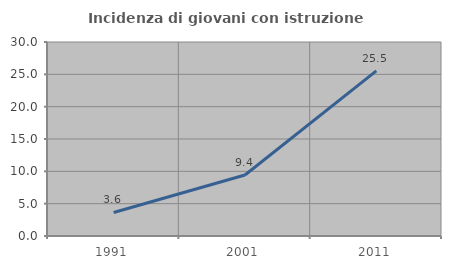
| Category | Incidenza di giovani con istruzione universitaria |
|---|---|
| 1991.0 | 3.636 |
| 2001.0 | 9.434 |
| 2011.0 | 25.532 |